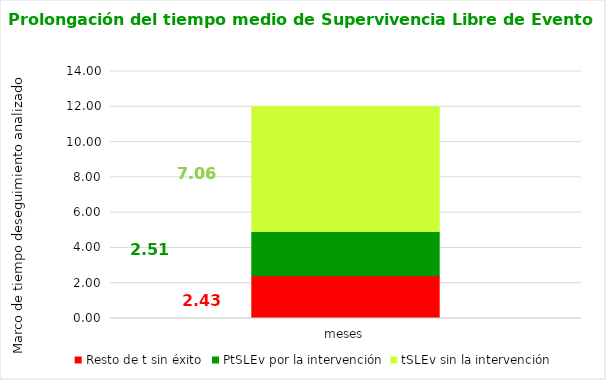
| Category | Resto de t sin éxito | PtSLEv por la intervención | tSLEv sin la intervención |
|---|---|---|---|
| meses | 2.425 | 2.512 | 7.063 |